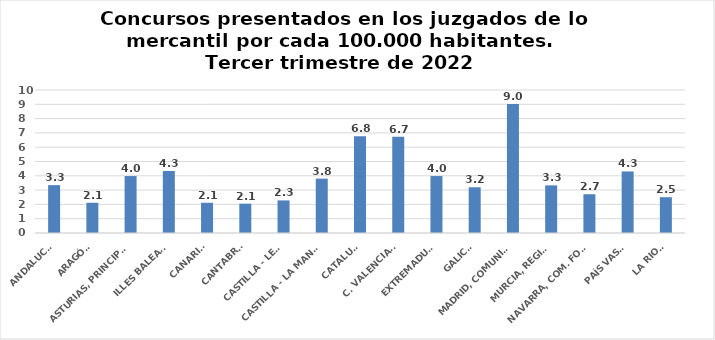
| Category | Series 0 |
|---|---|
| ANDALUCÍA | 3.348 |
| ARAGÓN | 2.113 |
| ASTURIAS, PRINCIPADO | 3.982 |
| ILLES BALEARS | 4.336 |
| CANARIAS | 2.114 |
| CANTABRIA | 2.051 |
| CASTILLA - LEÓN | 2.278 |
| CASTILLA - LA MANCHA | 3.801 |
| CATALUÑA | 6.758 |
| C. VALENCIANA | 6.738 |
| EXTREMADURA | 3.984 |
| GALICIA | 3.198 |
| MADRID, COMUNIDAD | 9.03 |
| MURCIA, REGIÓN | 3.33 |
| NAVARRA, COM. FORAL | 2.712 |
| PAÍS VASCO | 4.304 |
| LA RIOJA | 2.504 |